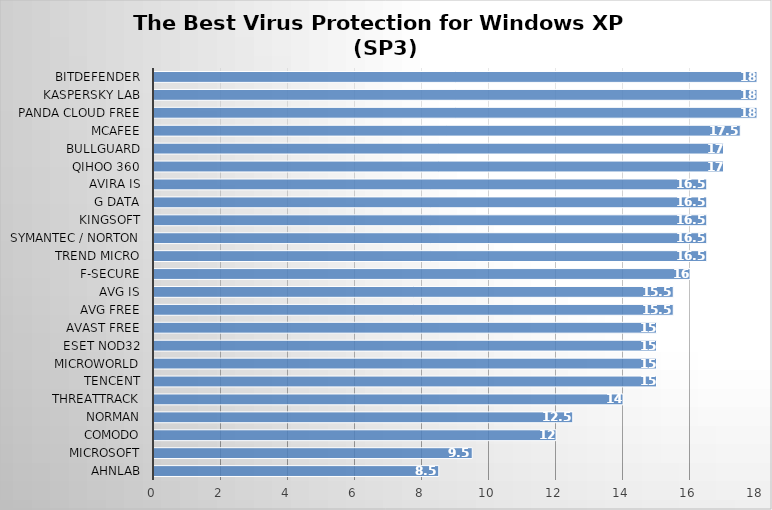
| Category | Series 0 |
|---|---|
| AhnLab | 8.5 |
| Microsoft | 9.5 |
| Comodo | 12 |
| Norman | 12.5 |
| ThreatTrack | 14 |
| Tencent | 15 |
| Microworld | 15 |
| ESET Nod32 | 15 |
| Avast Free | 15 |
| AVG Free | 15.5 |
| AVG IS | 15.5 |
| F-Secure | 16 |
| Trend Micro | 16.5 |
| Symantec / Norton | 16.5 |
| Kingsoft | 16.5 |
| G Data | 16.5 |
| Avira IS | 16.5 |
| Qihoo 360 | 17 |
| BullGuard | 17 |
| McAfee | 17.5 |
| Panda Cloud Free | 18 |
| Kaspersky Lab | 18 |
| Bitdefender | 18 |